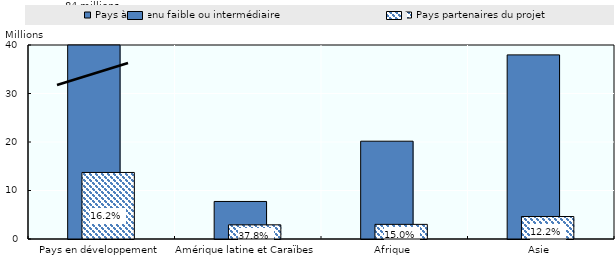
| Category | Pays à revenu faible ou intermédiaire | Pays partenaires du projet |
|---|---|---|
| Pays en développement | 84.834 | 13.718 |
| Amérique latine et Caraïbes | 7.74 | 2.924 |
| Afrique | 20.166 | 3.016 |
| Asie | 37.962 | 4.636 |